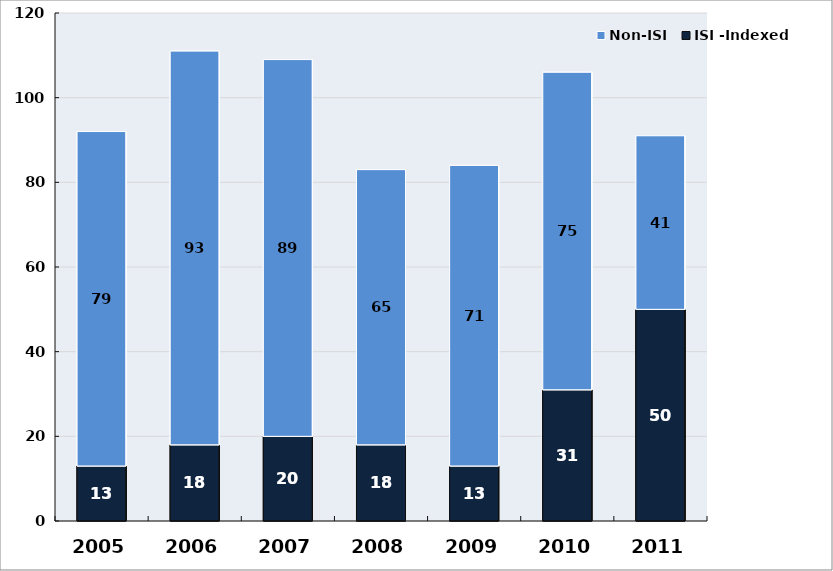
| Category | ISI -Indexed | Non-ISI |
|---|---|---|
| 2005.0 | 13 | 79 |
| 2006.0 | 18 | 93 |
| 2007.0 | 20 | 89 |
| 2008.0 | 18 | 65 |
| 2009.0 | 13 | 71 |
| 2010.0 | 31 | 75 |
| 2011.0 | 50 | 41 |